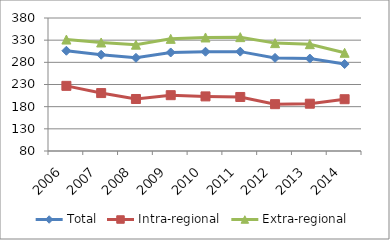
| Category | Total | Intra-regional | Extra-regional |
|---|---|---|---|
| 2006.0 | 306.12 | 226.944 | 331.389 |
| 2007.0 | 297.165 | 210.668 | 324.771 |
| 2008.0 | 290.171 | 197.318 | 319.805 |
| 2009.0 | 302.227 | 205.899 | 332.97 |
| 2010.0 | 303.909 | 203.165 | 336.061 |
| 2011.0 | 304.151 | 201.856 | 336.798 |
| 2012.0 | 290.031 | 185.638 | 323.348 |
| 2013.0 | 288.478 | 186.684 | 320.966 |
| 2014.0 | 276.185 | 196.805 | 301.519 |